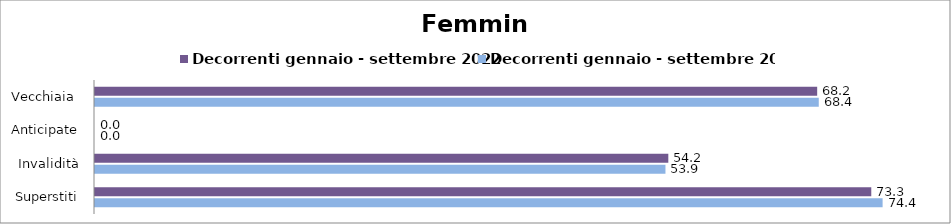
| Category | Decorrenti gennaio - settembre 2022 | Decorrenti gennaio - settembre 2023 |
|---|---|---|
| Vecchiaia  | 68.21 | 68.36 |
| Anticipate | 0 | 0 |
| Invalidità | 54.15 | 53.88 |
| Superstiti | 73.32 | 74.39 |